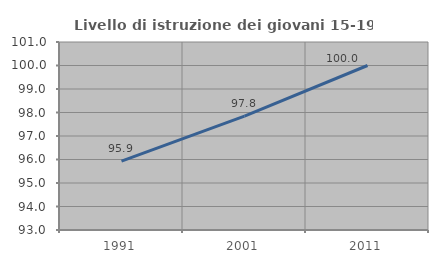
| Category | Livello di istruzione dei giovani 15-19 anni |
|---|---|
| 1991.0 | 95.93 |
| 2001.0 | 97.845 |
| 2011.0 | 100 |